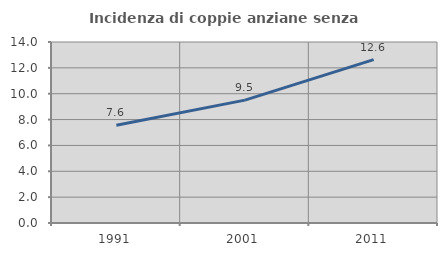
| Category | Incidenza di coppie anziane senza figli  |
|---|---|
| 1991.0 | 7.556 |
| 2001.0 | 9.504 |
| 2011.0 | 12.636 |